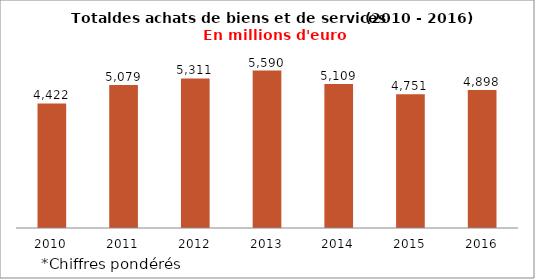
| Category | Total des achats de biens et de services |
|---|---|
| 2010 | 4421.663 |
| 2011 | 5079.278 |
| 2012 | 5311.482 |
| 2013 | 5590.179 |
| 2014 | 5108.615 |
| 2015 | 4751.181 |
| 2016 | 4898.013 |